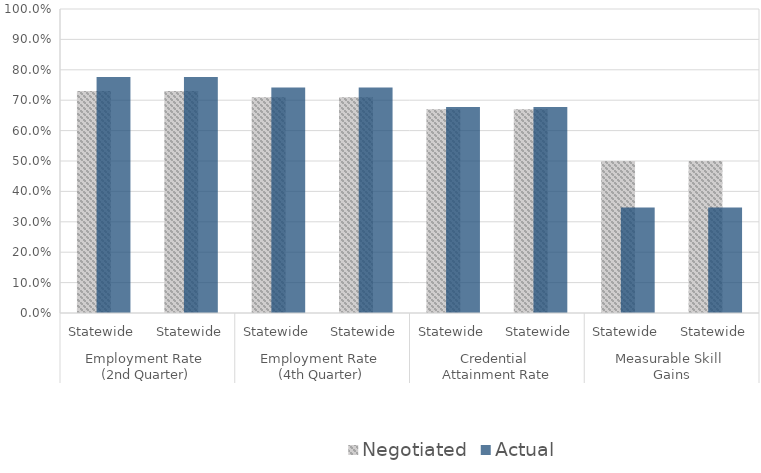
| Category | Negotiated | Actual |
|---|---|---|
| 0 | 0.73 | 0.776 |
| 1 | 0.73 | 0.776 |
| 2 | 0.71 | 0.742 |
| 3 | 0.71 | 0.742 |
| 4 | 0.67 | 0.678 |
| 5 | 0.67 | 0.678 |
| 6 | 0.5 | 0.347 |
| 7 | 0.5 | 0.347 |